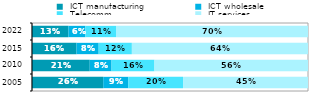
| Category |  ICT manufacturing |  ICT wholesale |  Telecomm. |  IT services |
|---|---|---|---|---|
| 2005.0 | 0.258 | 0.09 | 0.199 | 0.453 |
| 2010.0 | 0.209 | 0.079 | 0.156 | 0.556 |
| 2015.0 | 0.161 | 0.08 | 0.12 | 0.638 |
| 2022.0 | 0.132 | 0.062 | 0.111 | 0.696 |